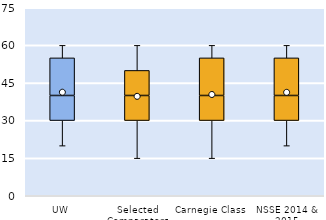
| Category | 25th | 50th | 75th |
|---|---|---|---|
| UW | 30 | 10 | 15 |
| Selected Comparators | 30 | 10 | 10 |
| Carnegie Class | 30 | 10 | 15 |
| NSSE 2014 & 2015 | 30 | 10 | 15 |